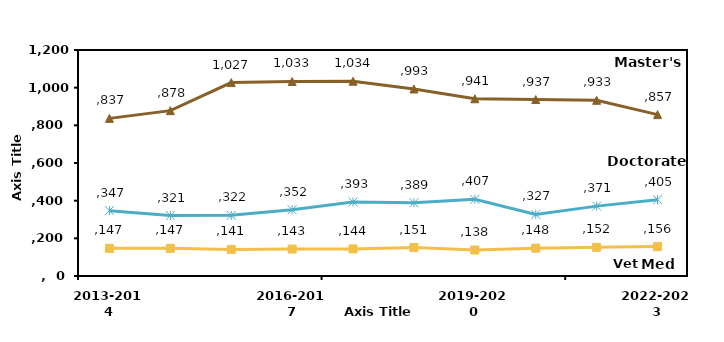
| Category | Series 1 | Series 2 | Series 4 |
|---|---|---|---|
| 2013-2014 | 147 | 837 | 347 |
| 2014-2015 | 147 | 878 | 321 |
| 2015-2016 | 141 | 1027 | 322 |
| 2016-2017 | 143 | 1033 | 352 |
| 2017-2018 | 144 | 1034 | 393 |
| 2018-2019 | 151 | 993 | 389 |
| 2019-2020 | 138 | 941 | 407 |
| 2020-2021 | 148 | 937 | 327 |
| 2021-2022 | 152 | 933 | 371 |
| 2022-2023 | 156 | 857 | 405 |